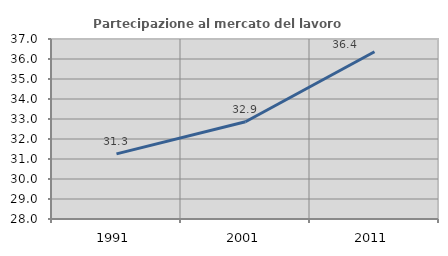
| Category | Partecipazione al mercato del lavoro  femminile |
|---|---|
| 1991.0 | 31.256 |
| 2001.0 | 32.865 |
| 2011.0 | 36.364 |